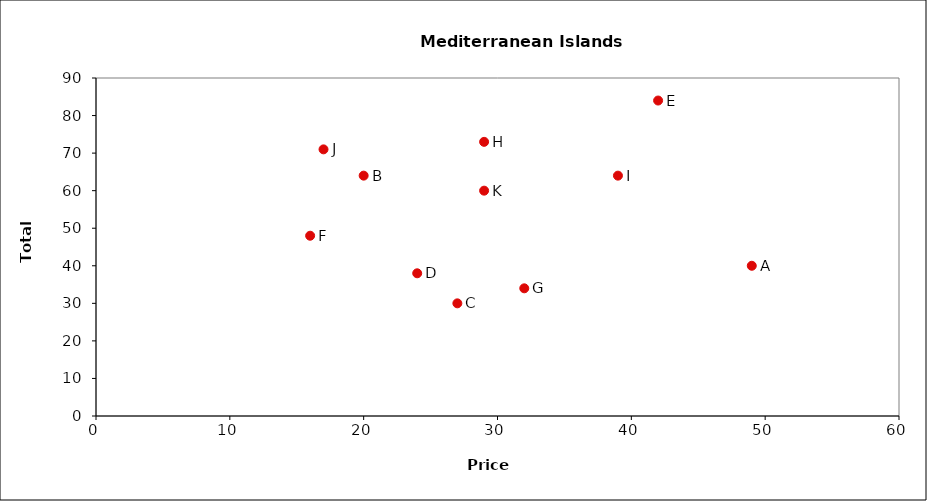
| Category | Kermit kontest |
|---|---|
| 49.0 | 40 |
| 20.0 | 64 |
| 27.0 | 30 |
| 24.0 | 38 |
| 42.0 | 84 |
| 16.0 | 48 |
| 32.0 | 34 |
| 29.0 | 73 |
| 39.0 | 64 |
| 17.0 | 71 |
| 29.0 | 60 |
| nan | 0 |